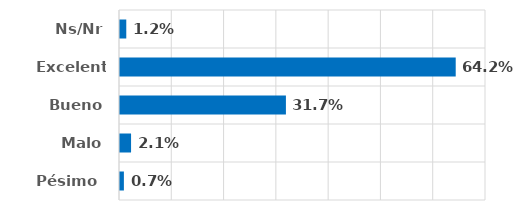
| Category | Series 0 |
|---|---|
| Pésimo  | 0.007 |
| Malo | 0.021 |
| Bueno | 0.317 |
| Excelente | 0.642 |
| Ns/Nr | 0.012 |